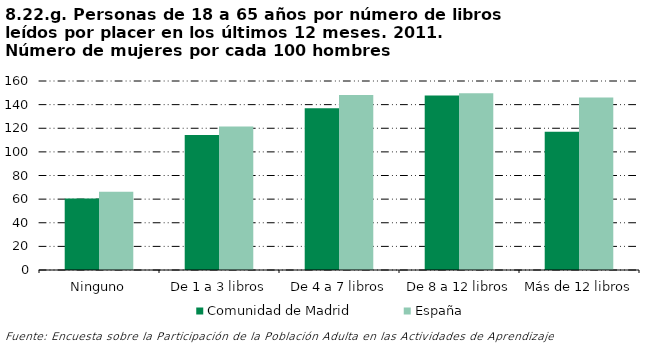
| Category | Comunidad de Madrid | España |
|---|---|---|
| Ninguno | 60.549 | 66.151 |
| De 1 a 3 libros | 114.336 | 121.572 |
| De 4 a 7 libros | 136.846 | 148.216 |
| De 8 a 12 libros | 147.821 | 149.639 |
| Más de 12 libros | 117.089 | 145.955 |